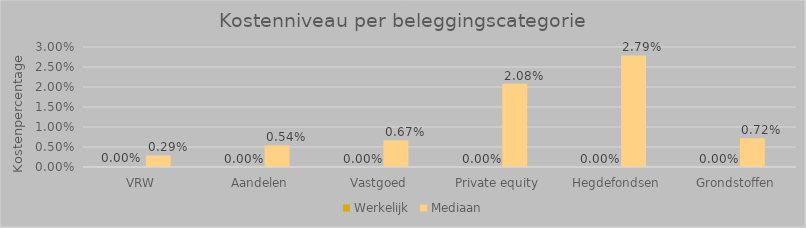
| Category | Werkelijk | Mediaan |
|---|---|---|
| VRW | 0 | 0.003 |
| Aandelen | 0 | 0.005 |
| Vastgoed | 0 | 0.007 |
| Private equity | 0 | 0.021 |
| Hegdefondsen | 0 | 0.028 |
| Grondstoffen | 0 | 0.007 |